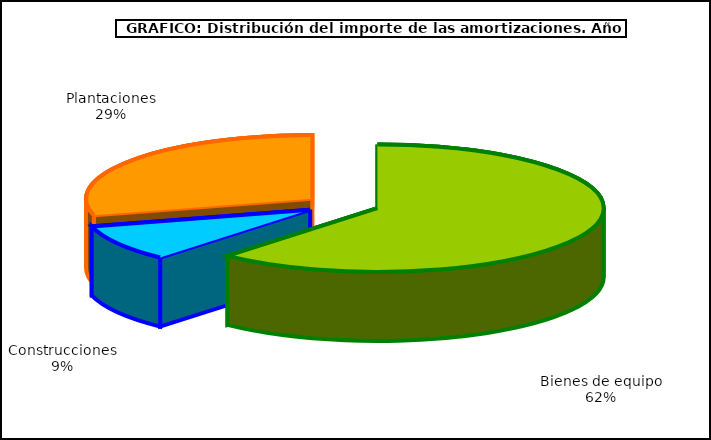
| Category | Series 0 |
|---|---|
| Bienes de equipo | 3168.393 |
| Construcciones | 477.436 |
| Plantaciones | 1503.149 |